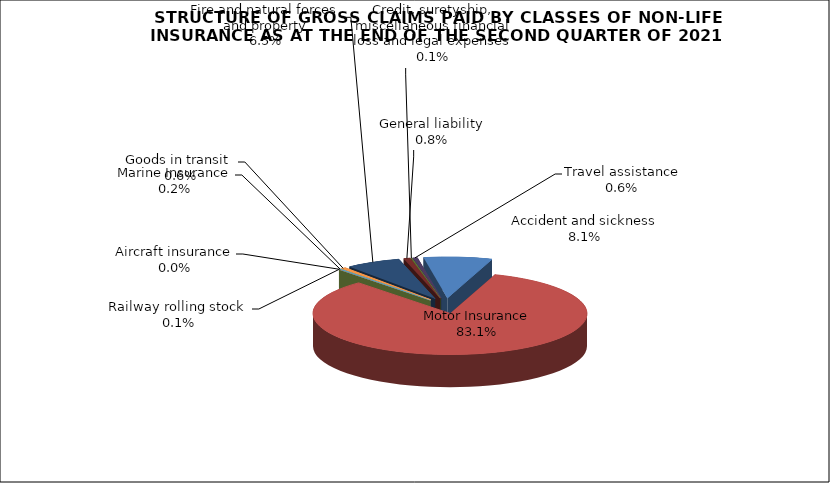
| Category | Accident and sickness |
|---|---|
| Accident and sickness | 0.081 |
| Motor Insurance | 0.831 |
| Railway rolling stock  | 0.001 |
| Aircraft insurance | 0 |
| Marine Insurance | 0.002 |
| Goods in transit  | 0.006 |
| Fire and natural forces and property | 0.065 |
| General liability | 0.008 |
| Credit, suretyship, miscellaneous financial loss and legal expenses | 0.001 |
| Travel assistance | 0.006 |